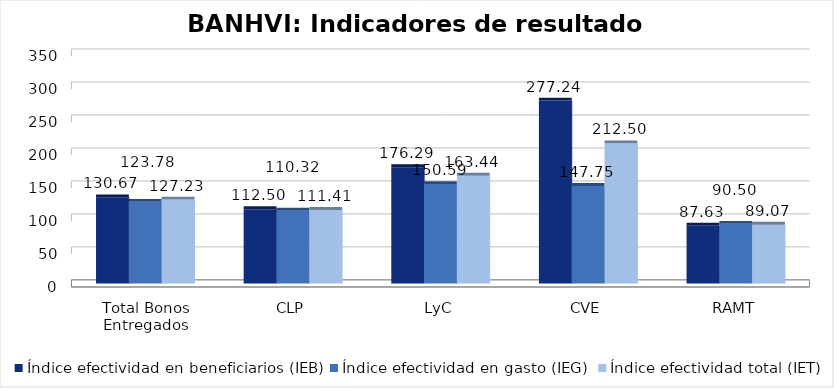
| Category | Índice efectividad en beneficiarios (IEB) | Índice efectividad en gasto (IEG)  | Índice efectividad total (IET) |
|---|---|---|---|
| Total Bonos Entregados | 130.67 | 123.782 | 127.226 |
| CLP | 112.502 | 110.317 | 111.41 |
| LyC | 176.294 | 150.591 | 163.443 |
| CVE | 277.243 | 147.753 | 212.498 |
| RAMT | 87.634 | 90.498 | 89.066 |